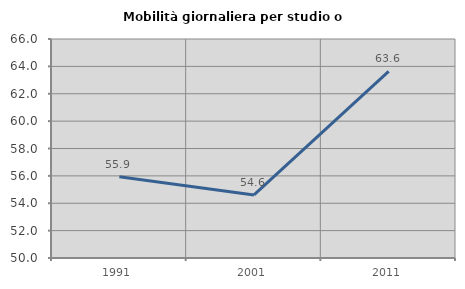
| Category | Mobilità giornaliera per studio o lavoro |
|---|---|
| 1991.0 | 55.944 |
| 2001.0 | 54.605 |
| 2011.0 | 63.636 |